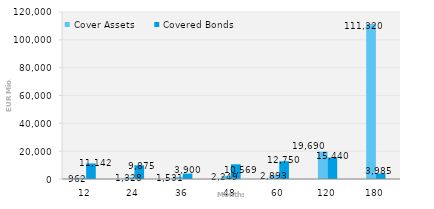
| Category | Cover Assets | Covered Bonds |
|---|---|---|
| 12.0 | 962.076 | 11142.407 |
| 24.0 | 1327.58 | 9875 |
| 36.0 | 1530.63 | 3900 |
| 48.0 | 2248.746 | 10568.564 |
| 60.0 | 2893.29 | 12750 |
| 120.0 | 19689.925 | 15440 |
| 180.0 | 111319.682 | 3985.146 |